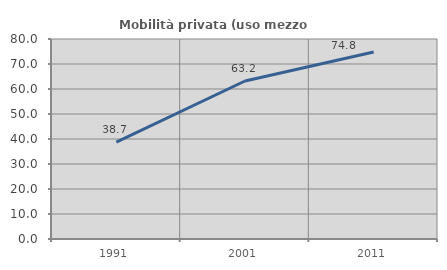
| Category | Mobilità privata (uso mezzo privato) |
|---|---|
| 1991.0 | 38.745 |
| 2001.0 | 63.204 |
| 2011.0 | 74.784 |